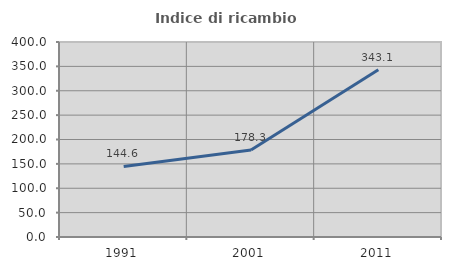
| Category | Indice di ricambio occupazionale  |
|---|---|
| 1991.0 | 144.617 |
| 2001.0 | 178.284 |
| 2011.0 | 343.098 |